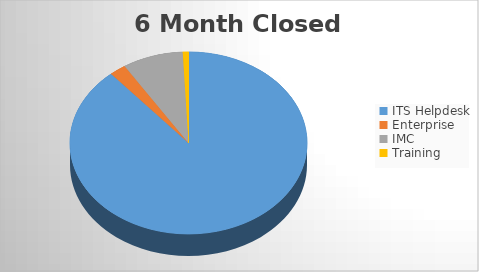
| Category | 6M Closed | 6M Opened |
|---|---|---|
| ITS Helpdesk | 2037 | 2030 |
| Enterprise | 52 | 45 |
| IMC | 190 | 192 |
| Training | 18 | 25 |